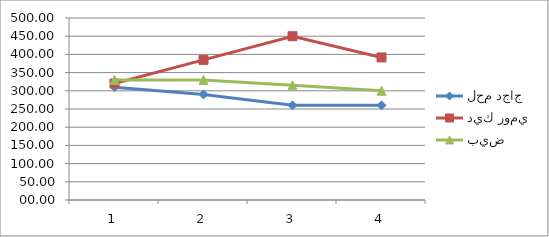
| Category | لحم دجاج | ديك رومي | بيض |
|---|---|---|---|
| 0 | 310 | 320 | 330 |
| 1 | 290 | 385 | 330 |
| 2 | 260 | 450 | 315 |
| 3 | 260 | 391.67 | 300 |